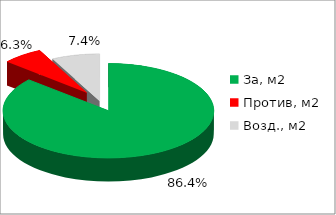
| Category | Series 0 |
|---|---|
| За, м2 | 0.864 |
| Против, м2 | 0.063 |
| Возд., м2 | 0.074 |